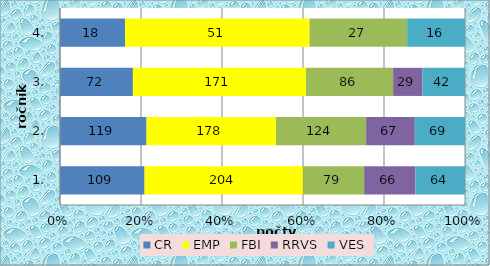
| Category | CR | EMP | FBI | RRVS | VES |
|---|---|---|---|---|---|
| 1. | 109 | 204 | 79 | 66 | 64 |
| 2. | 119 | 178 | 124 | 67 | 69 |
| 3. | 72 | 171 | 86 | 29 | 42 |
| 4. | 18 | 51 | 27 | 0 | 16 |